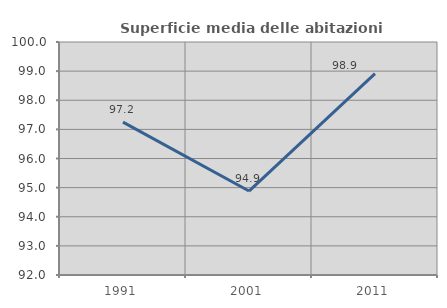
| Category | Superficie media delle abitazioni occupate |
|---|---|
| 1991.0 | 97.247 |
| 2001.0 | 94.883 |
| 2011.0 | 98.913 |